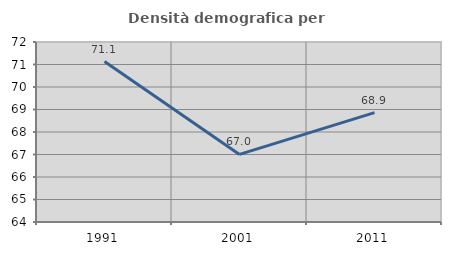
| Category | Densità demografica |
|---|---|
| 1991.0 | 71.13 |
| 2001.0 | 67.004 |
| 2011.0 | 68.863 |